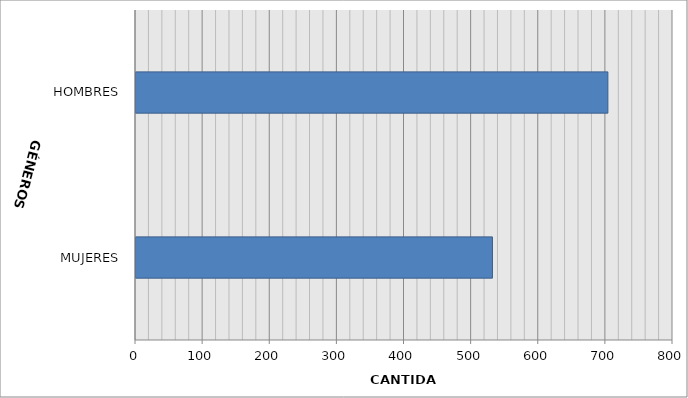
| Category | Series 0 |
|---|---|
| MUJERES | 531 |
| HOMBRES | 703 |